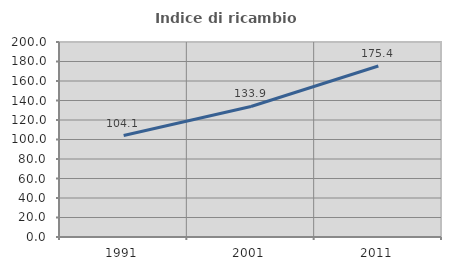
| Category | Indice di ricambio occupazionale  |
|---|---|
| 1991.0 | 104.082 |
| 2001.0 | 133.889 |
| 2011.0 | 175.397 |